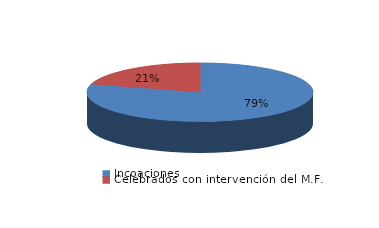
| Category | Series 0 |
|---|---|
| Incoaciones | 13792 |
| Celebrados con intervención del M.F. | 3576 |